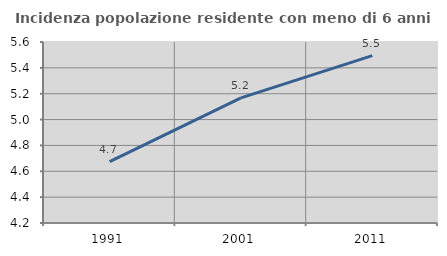
| Category | Incidenza popolazione residente con meno di 6 anni |
|---|---|
| 1991.0 | 4.675 |
| 2001.0 | 5.168 |
| 2011.0 | 5.495 |